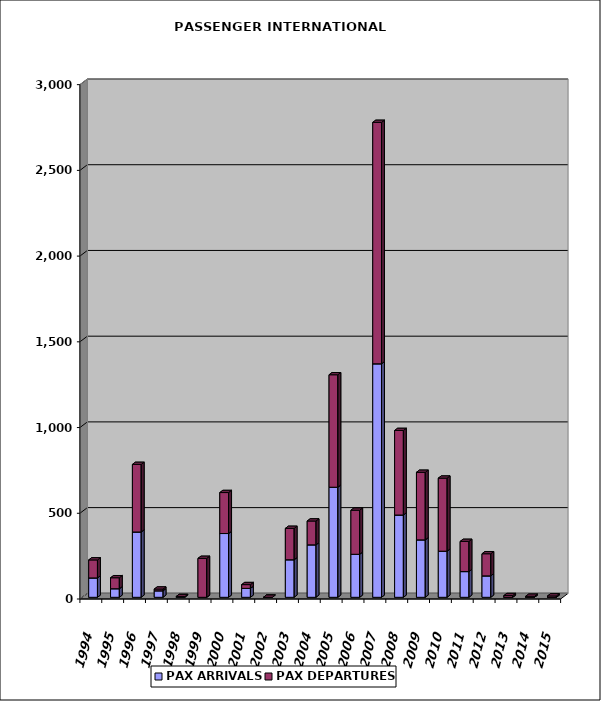
| Category | PAX ARRIVALS | PAX DEPARTURES |
|---|---|---|
| 1994.0 | 113 | 105 |
| 1995.0 | 50 | 64 |
| 1996.0 | 381 | 394 |
| 1997.0 | 38 | 10 |
| 1998.0 | 4 | 0 |
| 1999.0 | 0 | 227 |
| 2000.0 | 372 | 239 |
| 2001.0 | 52 | 22 |
| 2002.0 | 0 | 0 |
| 2003.0 | 219 | 183 |
| 2004.0 | 306 | 139 |
| 2005.0 | 642 | 656 |
| 2006.0 | 251 | 257 |
| 2007.0 | 1362 | 1408 |
| 2008.0 | 480 | 493 |
| 2009.0 | 335 | 394 |
| 2010.0 | 269 | 426 |
| 2011.0 | 150 | 176 |
| 2012.0 | 125 | 129 |
| 2013.0 | 0 | 10 |
| 2014.0 | 0 | 6 |
| 2015.0 | 0 | 8 |